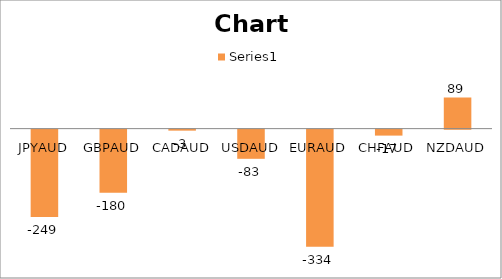
| Category | Series 0 |
|---|---|
| JPYAUD | -248.766 |
| GBPAUD | -180.2 |
| CADAUD | -2.869 |
| USDAUD | -83.141 |
| EURAUD | -333.65 |
| CHFAUD | -17.013 |
| NZDAUD | 88.715 |